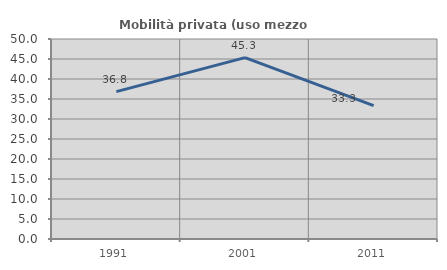
| Category | Mobilità privata (uso mezzo privato) |
|---|---|
| 1991.0 | 36.842 |
| 2001.0 | 45.333 |
| 2011.0 | 33.333 |